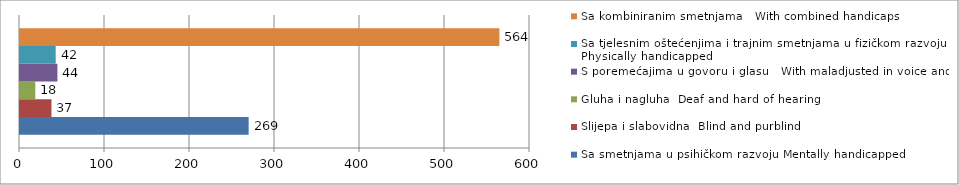
| Category | Sa smetnjama u psihičkom razvoju Mentally handicapped | Slijepa i slabovidna  Blind and purblind | Gluha i nagluha  Deaf and hard of hearing | S poremećajima u govoru i glasu   With maladjusted in voice and speak | Sa tjelesnim oštećenjima i trajnim smetnjama u fizičkom razvoju  Physically handicapped | Sa kombiniranim smetnjama   With combined handicaps |
|---|---|---|---|---|---|---|
| 0 | 269 | 37 | 18 | 44 | 42 | 564 |